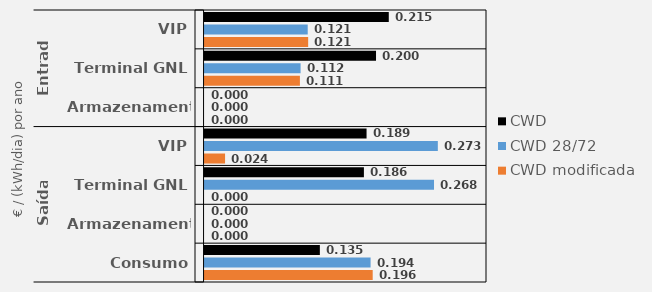
| Category | CWD | CWD 28/72 | CWD modificada |
|---|---|---|---|
| 0 | 0.215 | 0.121 | 0.121 |
| 1 | 0.2 | 0.112 | 0.111 |
| 2 | 0 | 0 | 0 |
| 3 | 0.189 | 0.273 | 0.024 |
| 4 | 0.186 | 0.268 | 0 |
| 5 | 0 | 0 | 0 |
| 6 | 0.135 | 0.194 | 0.196 |